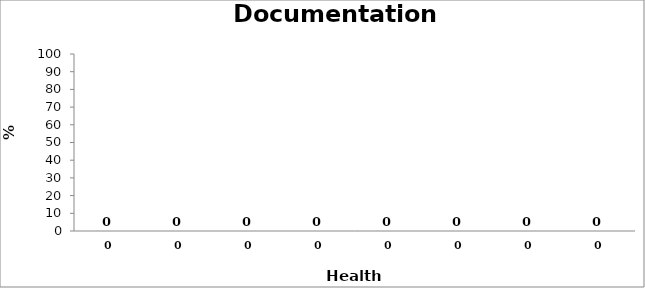
| Category | Series 1 |
|---|---|
| 0.0 | 0 |
| 0.0 | 0 |
| 0.0 | 0 |
| 0.0 | 0 |
| 0.0 | 0 |
| 0.0 | 0 |
| 0.0 | 0 |
| 0.0 | 0 |